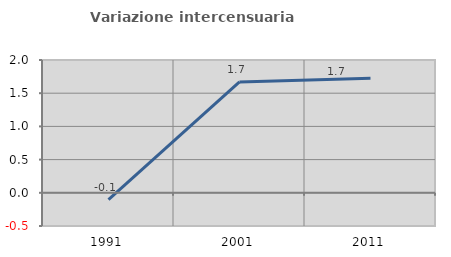
| Category | Variazione intercensuaria annua |
|---|---|
| 1991.0 | -0.101 |
| 2001.0 | 1.67 |
| 2011.0 | 1.727 |